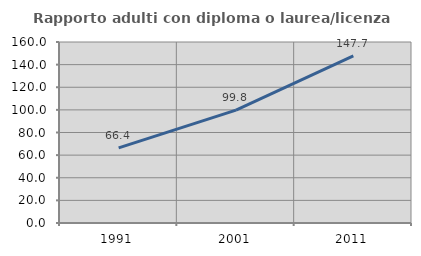
| Category | Rapporto adulti con diploma o laurea/licenza media  |
|---|---|
| 1991.0 | 66.386 |
| 2001.0 | 99.764 |
| 2011.0 | 147.712 |